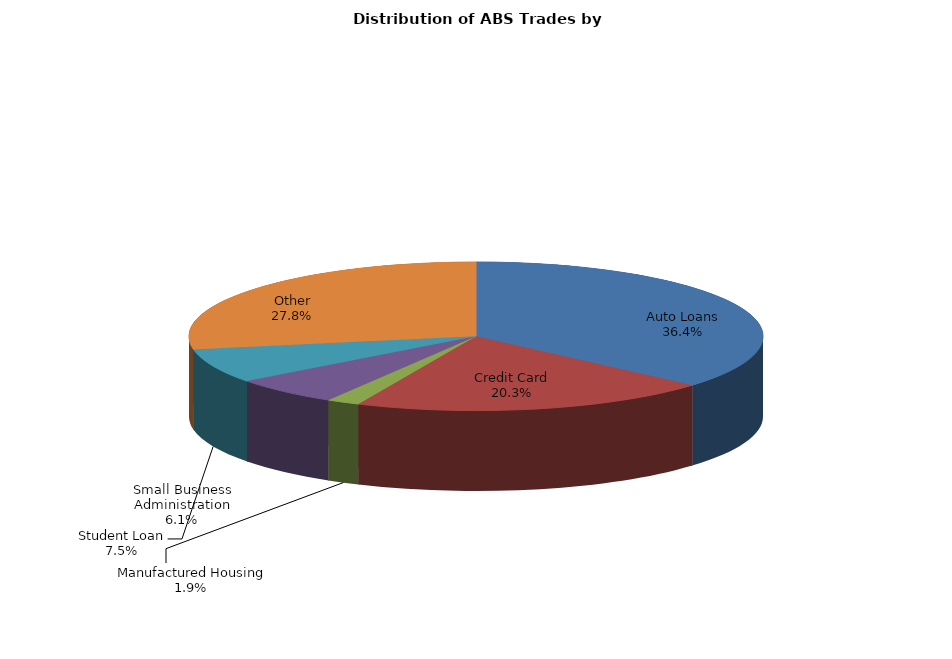
| Category | Series 0 |
|---|---|
| Auto Loans | 136.984 |
| Credit Card | 76.325 |
| Manufactured Housing | 7.06 |
| Small Business Administration | 22.956 |
| Student Loan | 28.135 |
| Other | 104.683 |